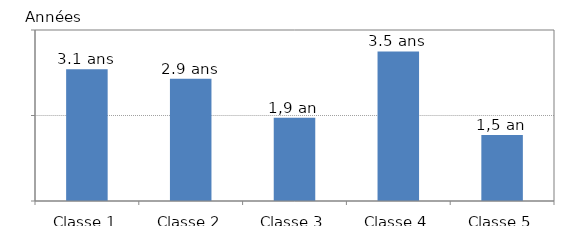
| Category | Series 0 |
|---|---|
| Classe 1 | 3.081 |
| Classe 2 | 2.857 |
| Classe 3 | 1.949 |
| Classe 4 | 3.498 |
| Classe 5 | 1.541 |